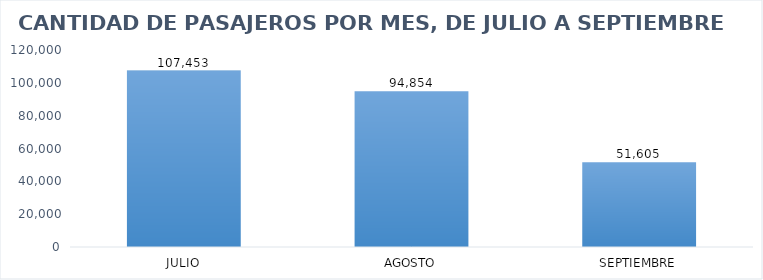
| Category | Series 0 |
|---|---|
| JULIO | 107453 |
| AGOSTO | 94854 |
| SEPTIEMBRE | 51605 |